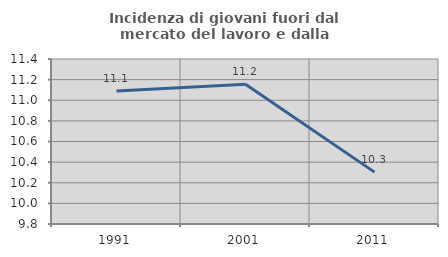
| Category | Incidenza di giovani fuori dal mercato del lavoro e dalla formazione  |
|---|---|
| 1991.0 | 11.089 |
| 2001.0 | 11.155 |
| 2011.0 | 10.303 |